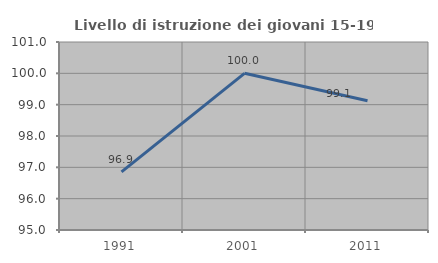
| Category | Livello di istruzione dei giovani 15-19 anni |
|---|---|
| 1991.0 | 96.855 |
| 2001.0 | 100 |
| 2011.0 | 99.123 |